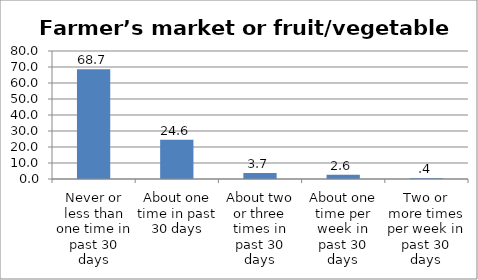
| Category | Series 0 |
|---|---|
| Never or less than one time in past 30 days | 68.659 |
| About one time in past 30 days | 24.563 |
| About two or three times in past 30 days | 3.73 |
| About one time per week in past 30 days | 2.614 |
| Two or more times per week in past 30 days | 0.434 |